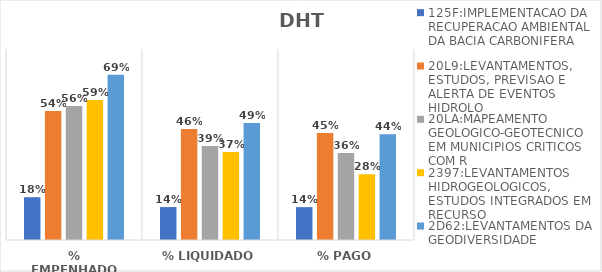
| Category | 125F:IMPLEMENTACAO DA RECUPERACAO AMBIENTAL DA BACIA CARBONIFERA | 20L9:LEVANTAMENTOS, ESTUDOS, PREVISAO E ALERTA DE EVENTOS HIDROLO | 20LA:MAPEAMENTO GEOLOGICO-GEOTECNICO EM MUNICIPIOS CRITICOS COM R | 2397:LEVANTAMENTOS HIDROGEOLOGICOS, ESTUDOS INTEGRADOS EM RECURSO | 2D62:LEVANTAMENTOS DA GEODIVERSIDADE |
|---|---|---|---|---|---|
| % EMPENHADO | 0.179 | 0.54 | 0.561 | 0.586 | 0.692 |
| % LIQUIDADO | 0.138 | 0.465 | 0.393 | 0.368 | 0.49 |
| % PAGO | 0.138 | 0.448 | 0.364 | 0.276 | 0.443 |